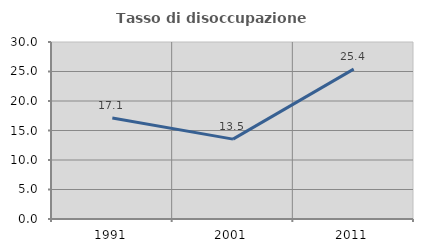
| Category | Tasso di disoccupazione giovanile  |
|---|---|
| 1991.0 | 17.123 |
| 2001.0 | 13.542 |
| 2011.0 | 25.397 |